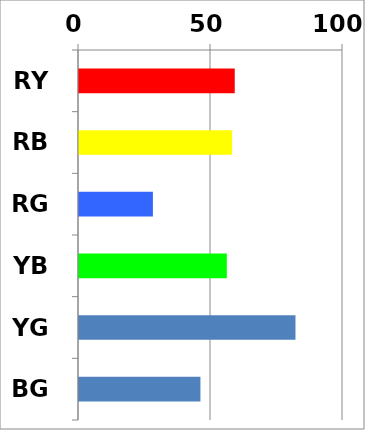
| Category | Series 0 |
|---|---|
| RY | 59 |
| RB | 58 |
| RG | 28 |
| YB | 56 |
| YG | 82 |
| BG | 46 |